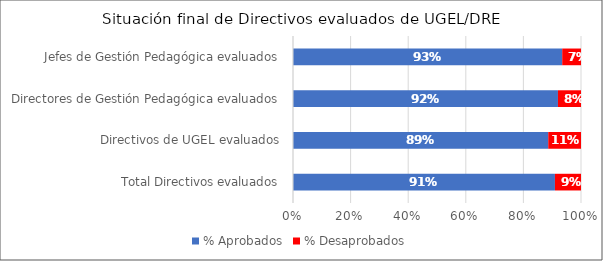
| Category | % Aprobados | % Desaprobados |
|---|---|---|
| Total Directivos evaluados | 0.91 | 0.09 |
| Directivos de UGEL evaluados | 0.886 | 0.114 |
| Directores de Gestión Pedagógica evaluados | 0.92 | 0.08 |
| Jefes de Gestión Pedagógica evaluados | 0.935 | 0.065 |